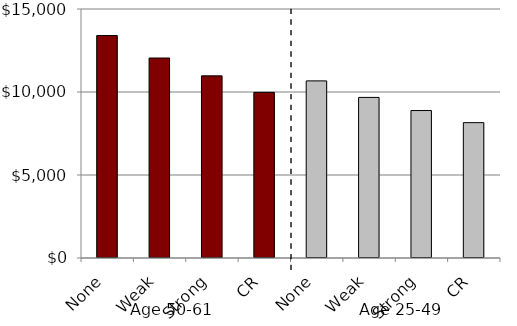
| Category | Large firm | Small firm |
|---|---|---|
| None |  | 13401 |
| Weak |  | 12047 |
| Strong |  | 10973 |
| CR |  | 9979 |
| None |  | 10670 |
| Weak |  | 9674 |
| Strong |  | 8883 |
| CR |  | 8154 |